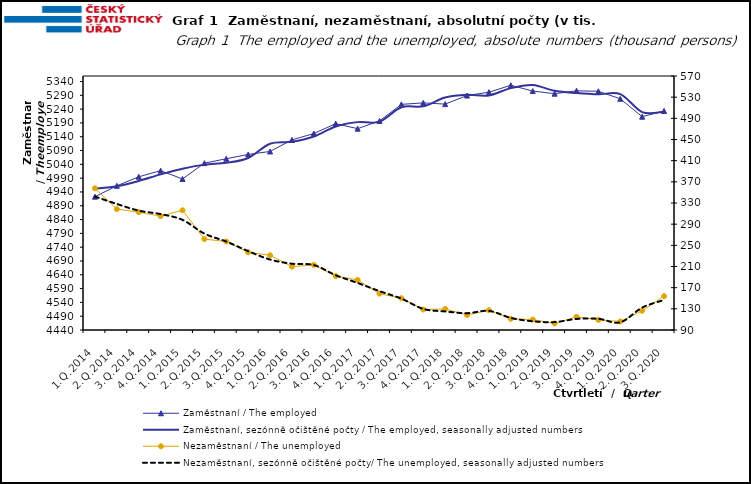
| Category | Zaměstnaní / The employed | Zaměstnaní, sezónně očištěné počty / The employed, seasonally adjusted numbers |
|---|---|---|
| 1.Q.2014 | 4922.963 | 4952.405 |
| 2.Q.2014 | 4962.219 | 4960.65 |
| 3.Q.2014 | 4994.947 | 4979.618 |
| 4.Q.2014 | 5017.051 | 5003.629 |
| 1.Q.2015 | 4987.141 | 5023.827 |
| 2.Q.2015 | 5044.285 | 5038.984 |
| 3.Q.2015 | 5060.3 | 5045.647 |
| 4.Q.2015 | 5075.884 | 5063.085 |
| 1.Q.2016 | 5086.671 | 5114.698 |
| 2.Q.2016 | 5128.493 | 5121.602 |
| 3.Q.2016 | 5151.712 | 5140.967 |
| 4.Q.2016 | 5187.436 | 5177.35 |
| 1.Q.2017 | 5169.203 | 5192.941 |
| 2.Q.2017 | 5197.265 | 5194.555 |
| 3.Q.2017 | 5257.26 | 5246.726 |
| 4.Q.2017 | 5262.691 | 5250.237 |
| 1.Q.2018 | 5258.225 | 5281.99 |
| 2.Q.2018 | 5289.242 | 5291.982 |
| 3.Q.2018 | 5301.361 | 5289.641 |
| 4.Q.2018 | 5326.327 | 5316.128 |
| 1.Q.2019 | 5305.534 | 5327.565 |
| 2.Q.2019 | 5295.929 | 5306.306 |
| 3.Q.2019 | 5306.247 | 5298.103 |
| 4.Q.2019 | 5304.7 | 5293.467 |
| 1.Q.2020 | 5277.418 | 5294.602 |
| 2.Q.2020 | 5212.593 | 5229.332 |
| 3.Q.2020 | 5233.335 | 5230.287 |